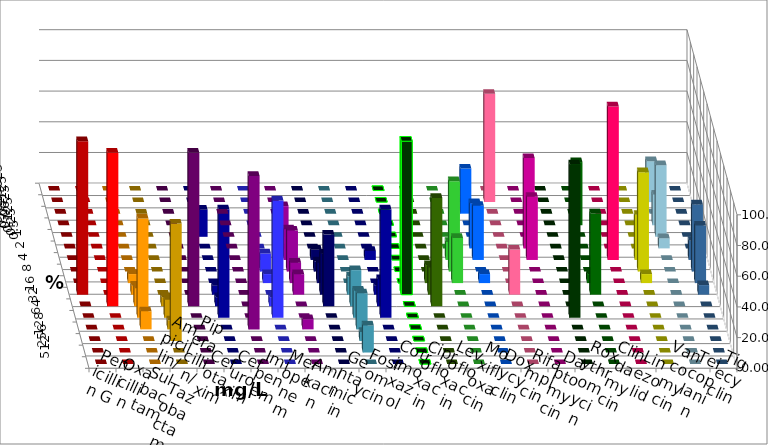
| Category | Penicillin G | Oxacillin | Ampicillin/ Sulbactam | Piperacillin/ Tazobactam | Cefotaxim | Cefuroxim | Imipenem | Meropenem | Amikacin | Gentamicin | Fosfomycin | Cotrimoxazol | Ciprofloxacin | Levofloxacin | Moxifloxacin | Doxycyclin | Rifampicin | Daptomycin | Roxythromycin | Clindamycin | Linezolid | Vancomycin | Teicoplanin | Tigecyclin |
|---|---|---|---|---|---|---|---|---|---|---|---|---|---|---|---|---|---|---|---|---|---|---|---|---|
| 0.015625 | 0 | 0 | 0 | 0 | 0 | 0 | 0 | 0 | 0 | 0 | 0 | 0 | 0 | 0 | 0 | 0 | 0 | 0 | 0 | 0 | 0 | 0 | 0 | 0 |
| 0.03125 | 0 | 0 | 0 | 0 | 0 | 0 | 0 | 0 | 0 | 0 | 0 | 0 | 0 | 0 | 0 | 0 | 70.588 | 0 | 0 | 0 | 0 | 0 | 0 | 26.667 |
| 0.0625 | 0 | 0 | 0 | 0 | 0 | 0 | 0 | 0 | 0 | 0 | 0 | 0 | 0 | 0 | 0 | 29.412 | 0 | 0 | 0 | 0 | 0 | 0 | 0 | 0 |
| 0.125 | 0 | 0 | 0 | 0 | 0 | 0 | 0 | 0 | 0 | 0 | 0 | 0 | 0 | 0 | 0 | 0 | 0 | 0 | 0 | 41.176 | 0 | 0 | 0 | 20 |
| 0.25 | 0 | 0 | 0 | 0 | 0 | 0 | 17.647 | 0 | 20 | 0 | 0 | 0 | 0 | 0 | 0 | 0 | 0 | 0 | 0 | 0 | 0 | 0 | 0 | 46.667 |
| 0.5 | 0 | 0 | 0 | 0 | 0 | 0 | 0 | 0 | 0 | 0 | 0 | 0 | 0 | 0 | 0 | 29.412 | 0 | 58.824 | 0 | 0 | 0 | 0 | 0 | 6.667 |
| 1.0 | 0 | 0 | 0 | 0 | 0 | 0 | 0 | 0 | 20 | 6.667 | 0 | 5.882 | 0 | 0 | 11.765 | 35.294 | 0 | 41.176 | 0 | 0 | 100 | 29.412 | 12.5 | 0 |
| 2.0 | 0 | 0 | 0 | 0 | 0 | 0 | 0 | 11.765 | 26.667 | 6.667 | 0 | 0 | 0 | 0 | 58.824 | 0 | 0 | 0 | 0 | 0 | 0 | 64.706 | 43.75 | 0 |
| 4.0 | 0 | 0 | 5.882 | 0 | 0 | 0 | 0 | 5.882 | 13.333 | 13.333 | 0 | 0 | 0 | 11.765 | 29.412 | 5.882 | 0 | 0 | 0 | 5.882 | 0 | 5.882 | 37.5 | 0 |
| 8.0 | 100 | 0 | 5.882 | 0 | 0 | 0 | 5.882 | 0 | 13.333 | 26.667 | 11.765 | 5.882 | 100 | 17.647 | 0 | 0 | 29.412 | 0 | 0 | 52.941 | 0 | 0 | 6.25 | 0 |
| 16.0 | 0 | 100 | 11.765 | 5.882 | 100 | 0 | 5.882 | 5.882 | 0 | 46.667 | 23.529 | 17.647 | 0 | 70.588 | 0 | 0 | 0 | 0 | 0 | 0 | 0 | 0 | 0 | 0 |
| 32.0 | 0 | 0 | 64.706 | 11.765 | 0 | 0 | 70.588 | 76.471 | 0 | 0 | 17.647 | 70.588 | 0 | 0 | 0 | 0 | 0 | 0 | 100 | 0 | 0 | 0 | 0 | 0 |
| 64.0 | 0 | 0 | 11.765 | 5.882 | 0 | 100 | 0 | 0 | 6.667 | 0 | 23.529 | 0 | 0 | 0 | 0 | 0 | 0 | 0 | 0 | 0 | 0 | 0 | 0 | 0 |
| 128.0 | 0 | 0 | 0 | 76.471 | 0 | 0 | 0 | 0 | 0 | 0 | 5.882 | 0 | 0 | 0 | 0 | 0 | 0 | 0 | 0 | 0 | 0 | 0 | 0 | 0 |
| 256.0 | 0 | 0 | 0 | 0 | 0 | 0 | 0 | 0 | 0 | 0 | 17.647 | 0 | 0 | 0 | 0 | 0 | 0 | 0 | 0 | 0 | 0 | 0 | 0 | 0 |
| 512.0 | 0 | 0 | 0 | 0 | 0 | 0 | 0 | 0 | 0 | 0 | 0 | 0 | 0 | 0 | 0 | 0 | 0 | 0 | 0 | 0 | 0 | 0 | 0 | 0 |